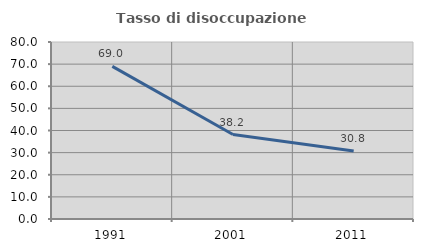
| Category | Tasso di disoccupazione giovanile  |
|---|---|
| 1991.0 | 68.996 |
| 2001.0 | 38.172 |
| 2011.0 | 30.769 |